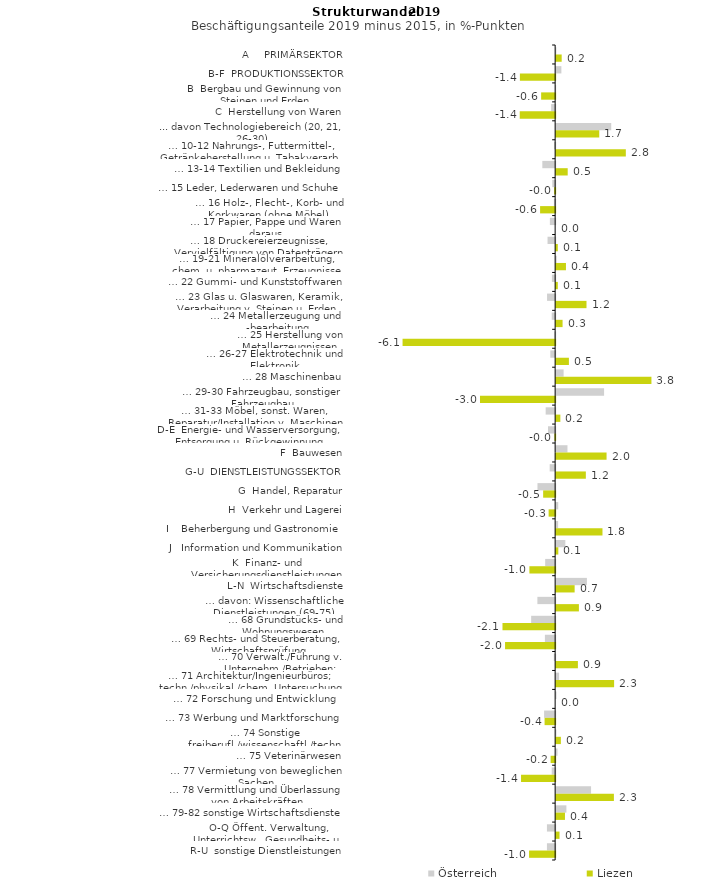
| Category | Österreich | Liezen |
|---|---|---|
| A     PRIMÄRSEKTOR | 0.009 | 0.22 |
| B-F  PRODUKTIONSSEKTOR | 0.208 | -1.402 |
| B  Bergbau und Gewinnung von Steinen und Erden | -0.008 | -0.557 |
| C  Herstellung von Waren | -0.159 | -1.408 |
| ... davon Technologiebereich (20, 21, 26-30) | 2.191 | 1.714 |
| … 10-12 Nahrungs-, Futtermittel-, Getränkeherstellung u. Tabakverarb. | -0.044 | 2.771 |
| … 13-14 Textilien und Bekleidung | -0.51 | 0.46 |
| … 15 Leder, Lederwaren und Schuhe | -0.114 | -0.042 |
| … 16 Holz-, Flecht-, Korb- und Korkwaren (ohne Möbel)  | -0.049 | -0.599 |
| … 17 Papier, Pappe und Waren daraus  | -0.209 | 0 |
| … 18 Druckereierzeugnisse, Vervielfältigung von Datenträgern | -0.302 | 0.066 |
| … 19-21 Mineralölverarbeitung, chem. u. pharmazeut. Erzeugnisse | 0.022 | 0.39 |
| … 22 Gummi- und Kunststoffwaren | -0.128 | 0.066 |
| … 23 Glas u. Glaswaren, Keramik, Verarbeitung v. Steinen u. Erden  | -0.322 | 1.207 |
| … 24 Metallerzeugung und -bearbeitung | -0.136 | 0.256 |
| … 25 Herstellung von Metallerzeugnissen  | -0.032 | -6.068 |
| … 26-27 Elektrotechnik und Elektronik | -0.193 | 0.508 |
| … 28 Maschinenbau | 0.297 | 3.79 |
| … 29-30 Fahrzeugbau, sonstiger Fahrzeugbau | 1.906 | -2.989 |
| … 31-33 Möbel, sonst. Waren, Reparatur/Installation v. Maschinen | -0.377 | 0.167 |
| D-E  Energie- und Wasserversorgung, Entsorgung u. Rückgewinnung | -0.284 | -0.03 |
| F  Bauwesen | 0.45 | 2.005 |
| G-U  DIENSTLEISTUNGSSEKTOR | -0.217 | 1.181 |
| G  Handel, Reparatur | -0.703 | -0.477 |
| H  Verkehr und Lagerei | 0.083 | -0.26 |
| I    Beherbergung und Gastronomie | 0.078 | 1.843 |
| J   Information und Kommunikation | 0.366 | 0.086 |
| K  Finanz- und Versicherungsdienstleistungen | -0.397 | -1.025 |
| L-N  Wirtschaftsdienste | 1.224 | 0.736 |
| … davon: Wissenschaftliche Dienstleistungen (69-75) | -0.706 | 0.905 |
| … 68 Grundstücks- und Wohnungswesen  | -0.954 | -2.094 |
| … 69 Rechts- und Steuerberatung, Wirtschaftsprüfung | -0.408 | -1.992 |
| … 70 Verwalt./Führung v. Unternehm./Betrieben; Unternehmensberat. | -0.052 | 0.865 |
| … 71 Architektur/Ingenieurbüros; techn./physikal./chem. Untersuchung | 0.116 | 2.306 |
| … 72 Forschung und Entwicklung  | 0.013 | 0 |
| … 73 Werbung und Marktforschung | -0.44 | -0.42 |
| … 74 Sonstige freiberufl./wissenschaftl./techn. Tätigkeiten | 0.011 | 0.188 |
| … 75 Veterinärwesen | 0.053 | -0.18 |
| … 77 Vermietung von beweglichen Sachen  | -0.137 | -1.357 |
| … 78 Vermittlung und Überlassung von Arbeitskräften | 1.388 | 2.297 |
| … 79-82 sonstige Wirtschaftsdienste | 0.408 | 0.351 |
| O-Q Öffent. Verwaltung, Unterrichtsw., Gesundheits- u. Sozialwesen | -0.326 | 0.134 |
| R-U  sonstige Dienstleistungen | -0.326 | -1.037 |